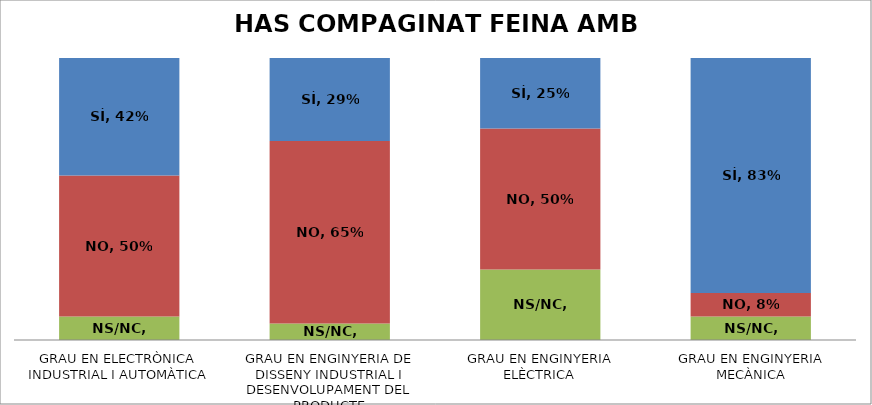
| Category | NS/NC | NO | SÍ |
|---|---|---|---|
| GRAU EN ELECTRÒNICA INDUSTRIAL I AUTOMÀTICA | 0.083 | 0.5 | 0.417 |
| GRAU EN ENGINYERIA DE DISSENY INDUSTRIAL I DESENVOLUPAMENT DEL PRODUCTE | 0.059 | 0.647 | 0.294 |
| GRAU EN ENGINYERIA ELÈCTRICA | 0.25 | 0.5 | 0.25 |
| GRAU EN ENGINYERIA MECÀNICA | 0.083 | 0.083 | 0.833 |